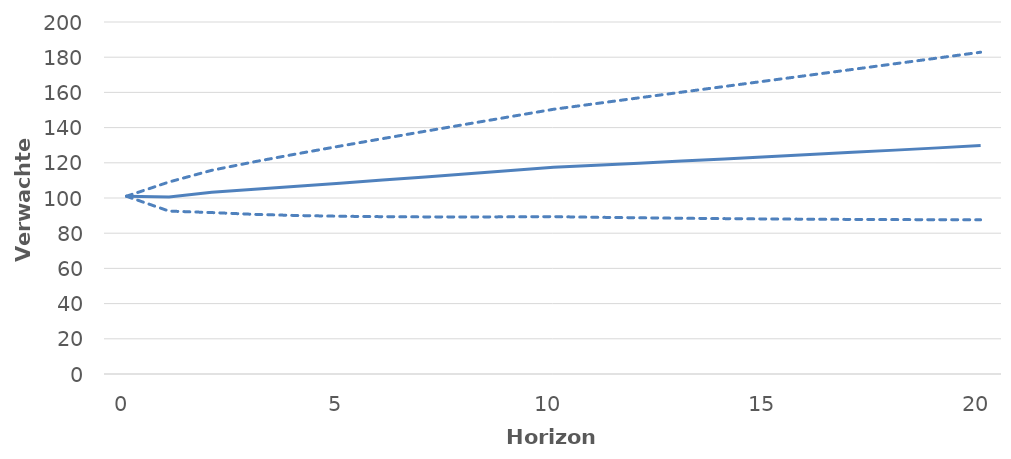
| Category | verwachte uitkeringen | 5% kwantiel | 95% kwantiel |
|---|---|---|---|
| 0.0 | 101 | 101 | 101 |
| 1.0 | 100.616 | 92.556 | 109.104 |
| 2.0 | 103.295 | 91.723 | 115.746 |
| 3.0 | 104.977 | 90.698 | 120.595 |
| 4.0 | 106.682 | 90.05 | 125.128 |
| 5.0 | 108.411 | 89.638 | 129.487 |
| 6.0 | 110.164 | 89.39 | 133.743 |
| 7.0 | 111.941 | 89.267 | 137.939 |
| 8.0 | 113.743 | 89.239 | 142.103 |
| 9.0 | 115.569 | 89.29 | 146.254 |
| 10.0 | 117.421 | 89.406 | 150.406 |
| 11.0 | 118.601 | 89.055 | 153.667 |
| 12.0 | 119.793 | 88.754 | 156.909 |
| 13.0 | 120.997 | 88.499 | 160.14 |
| 14.0 | 122.213 | 88.283 | 163.366 |
| 15.0 | 123.441 | 88.102 | 166.591 |
| 16.0 | 124.682 | 87.952 | 169.82 |
| 17.0 | 125.935 | 87.832 | 173.055 |
| 18.0 | 127.201 | 87.737 | 176.301 |
| 19.0 | 128.479 | 87.666 | 179.559 |
| 20.0 | 129.77 | 87.616 | 182.832 |